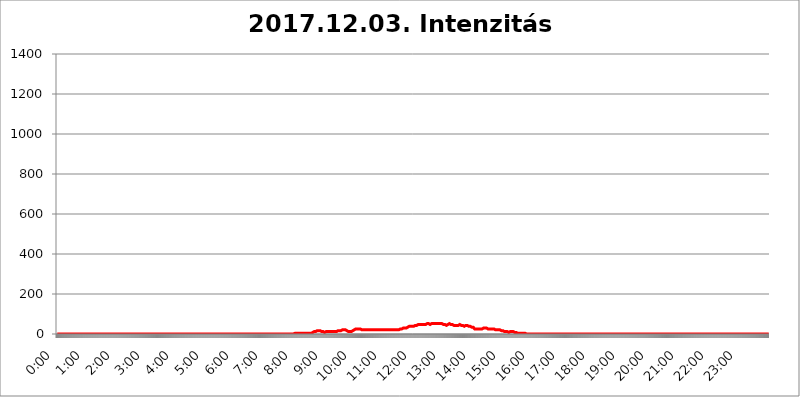
| Category | 2017.12.03. Intenzitás [W/m^2] |
|---|---|
| 0.0 | 0 |
| 0.0006944444444444445 | 0 |
| 0.001388888888888889 | 0 |
| 0.0020833333333333333 | 0 |
| 0.002777777777777778 | 0 |
| 0.003472222222222222 | 0 |
| 0.004166666666666667 | 0 |
| 0.004861111111111111 | 0 |
| 0.005555555555555556 | 0 |
| 0.0062499999999999995 | 0 |
| 0.006944444444444444 | 0 |
| 0.007638888888888889 | 0 |
| 0.008333333333333333 | 0 |
| 0.009027777777777779 | 0 |
| 0.009722222222222222 | 0 |
| 0.010416666666666666 | 0 |
| 0.011111111111111112 | 0 |
| 0.011805555555555555 | 0 |
| 0.012499999999999999 | 0 |
| 0.013194444444444444 | 0 |
| 0.013888888888888888 | 0 |
| 0.014583333333333332 | 0 |
| 0.015277777777777777 | 0 |
| 0.015972222222222224 | 0 |
| 0.016666666666666666 | 0 |
| 0.017361111111111112 | 0 |
| 0.018055555555555557 | 0 |
| 0.01875 | 0 |
| 0.019444444444444445 | 0 |
| 0.02013888888888889 | 0 |
| 0.020833333333333332 | 0 |
| 0.02152777777777778 | 0 |
| 0.022222222222222223 | 0 |
| 0.02291666666666667 | 0 |
| 0.02361111111111111 | 0 |
| 0.024305555555555556 | 0 |
| 0.024999999999999998 | 0 |
| 0.025694444444444447 | 0 |
| 0.02638888888888889 | 0 |
| 0.027083333333333334 | 0 |
| 0.027777777777777776 | 0 |
| 0.02847222222222222 | 0 |
| 0.029166666666666664 | 0 |
| 0.029861111111111113 | 0 |
| 0.030555555555555555 | 0 |
| 0.03125 | 0 |
| 0.03194444444444445 | 0 |
| 0.03263888888888889 | 0 |
| 0.03333333333333333 | 0 |
| 0.034027777777777775 | 0 |
| 0.034722222222222224 | 0 |
| 0.035416666666666666 | 0 |
| 0.036111111111111115 | 0 |
| 0.03680555555555556 | 0 |
| 0.0375 | 0 |
| 0.03819444444444444 | 0 |
| 0.03888888888888889 | 0 |
| 0.03958333333333333 | 0 |
| 0.04027777777777778 | 0 |
| 0.04097222222222222 | 0 |
| 0.041666666666666664 | 0 |
| 0.042361111111111106 | 0 |
| 0.04305555555555556 | 0 |
| 0.043750000000000004 | 0 |
| 0.044444444444444446 | 0 |
| 0.04513888888888889 | 0 |
| 0.04583333333333334 | 0 |
| 0.04652777777777778 | 0 |
| 0.04722222222222222 | 0 |
| 0.04791666666666666 | 0 |
| 0.04861111111111111 | 0 |
| 0.049305555555555554 | 0 |
| 0.049999999999999996 | 0 |
| 0.05069444444444445 | 0 |
| 0.051388888888888894 | 0 |
| 0.052083333333333336 | 0 |
| 0.05277777777777778 | 0 |
| 0.05347222222222222 | 0 |
| 0.05416666666666667 | 0 |
| 0.05486111111111111 | 0 |
| 0.05555555555555555 | 0 |
| 0.05625 | 0 |
| 0.05694444444444444 | 0 |
| 0.057638888888888885 | 0 |
| 0.05833333333333333 | 0 |
| 0.05902777777777778 | 0 |
| 0.059722222222222225 | 0 |
| 0.06041666666666667 | 0 |
| 0.061111111111111116 | 0 |
| 0.06180555555555556 | 0 |
| 0.0625 | 0 |
| 0.06319444444444444 | 0 |
| 0.06388888888888888 | 0 |
| 0.06458333333333334 | 0 |
| 0.06527777777777778 | 0 |
| 0.06597222222222222 | 0 |
| 0.06666666666666667 | 0 |
| 0.06736111111111111 | 0 |
| 0.06805555555555555 | 0 |
| 0.06874999999999999 | 0 |
| 0.06944444444444443 | 0 |
| 0.07013888888888889 | 0 |
| 0.07083333333333333 | 0 |
| 0.07152777777777779 | 0 |
| 0.07222222222222223 | 0 |
| 0.07291666666666667 | 0 |
| 0.07361111111111111 | 0 |
| 0.07430555555555556 | 0 |
| 0.075 | 0 |
| 0.07569444444444444 | 0 |
| 0.0763888888888889 | 0 |
| 0.07708333333333334 | 0 |
| 0.07777777777777778 | 0 |
| 0.07847222222222222 | 0 |
| 0.07916666666666666 | 0 |
| 0.0798611111111111 | 0 |
| 0.08055555555555556 | 0 |
| 0.08125 | 0 |
| 0.08194444444444444 | 0 |
| 0.08263888888888889 | 0 |
| 0.08333333333333333 | 0 |
| 0.08402777777777777 | 0 |
| 0.08472222222222221 | 0 |
| 0.08541666666666665 | 0 |
| 0.08611111111111112 | 0 |
| 0.08680555555555557 | 0 |
| 0.08750000000000001 | 0 |
| 0.08819444444444445 | 0 |
| 0.08888888888888889 | 0 |
| 0.08958333333333333 | 0 |
| 0.09027777777777778 | 0 |
| 0.09097222222222222 | 0 |
| 0.09166666666666667 | 0 |
| 0.09236111111111112 | 0 |
| 0.09305555555555556 | 0 |
| 0.09375 | 0 |
| 0.09444444444444444 | 0 |
| 0.09513888888888888 | 0 |
| 0.09583333333333333 | 0 |
| 0.09652777777777777 | 0 |
| 0.09722222222222222 | 0 |
| 0.09791666666666667 | 0 |
| 0.09861111111111111 | 0 |
| 0.09930555555555555 | 0 |
| 0.09999999999999999 | 0 |
| 0.10069444444444443 | 0 |
| 0.1013888888888889 | 0 |
| 0.10208333333333335 | 0 |
| 0.10277777777777779 | 0 |
| 0.10347222222222223 | 0 |
| 0.10416666666666667 | 0 |
| 0.10486111111111111 | 0 |
| 0.10555555555555556 | 0 |
| 0.10625 | 0 |
| 0.10694444444444444 | 0 |
| 0.1076388888888889 | 0 |
| 0.10833333333333334 | 0 |
| 0.10902777777777778 | 0 |
| 0.10972222222222222 | 0 |
| 0.1111111111111111 | 0 |
| 0.11180555555555556 | 0 |
| 0.11180555555555556 | 0 |
| 0.1125 | 0 |
| 0.11319444444444444 | 0 |
| 0.11388888888888889 | 0 |
| 0.11458333333333333 | 0 |
| 0.11527777777777777 | 0 |
| 0.11597222222222221 | 0 |
| 0.11666666666666665 | 0 |
| 0.1173611111111111 | 0 |
| 0.11805555555555557 | 0 |
| 0.11944444444444445 | 0 |
| 0.12013888888888889 | 0 |
| 0.12083333333333333 | 0 |
| 0.12152777777777778 | 0 |
| 0.12222222222222223 | 0 |
| 0.12291666666666667 | 0 |
| 0.12291666666666667 | 0 |
| 0.12361111111111112 | 0 |
| 0.12430555555555556 | 0 |
| 0.125 | 0 |
| 0.12569444444444444 | 0 |
| 0.12638888888888888 | 0 |
| 0.12708333333333333 | 0 |
| 0.16875 | 0 |
| 0.12847222222222224 | 0 |
| 0.12916666666666668 | 0 |
| 0.12986111111111112 | 0 |
| 0.13055555555555556 | 0 |
| 0.13125 | 0 |
| 0.13194444444444445 | 0 |
| 0.1326388888888889 | 0 |
| 0.13333333333333333 | 0 |
| 0.13402777777777777 | 0 |
| 0.13402777777777777 | 0 |
| 0.13472222222222222 | 0 |
| 0.13541666666666666 | 0 |
| 0.1361111111111111 | 0 |
| 0.13749999999999998 | 0 |
| 0.13819444444444443 | 0 |
| 0.1388888888888889 | 0 |
| 0.13958333333333334 | 0 |
| 0.14027777777777778 | 0 |
| 0.14097222222222222 | 0 |
| 0.14166666666666666 | 0 |
| 0.1423611111111111 | 0 |
| 0.14305555555555557 | 0 |
| 0.14375000000000002 | 0 |
| 0.14444444444444446 | 0 |
| 0.1451388888888889 | 0 |
| 0.1451388888888889 | 0 |
| 0.14652777777777778 | 0 |
| 0.14722222222222223 | 0 |
| 0.14791666666666667 | 0 |
| 0.1486111111111111 | 0 |
| 0.14930555555555555 | 0 |
| 0.15 | 0 |
| 0.15069444444444444 | 0 |
| 0.15138888888888888 | 0 |
| 0.15208333333333332 | 0 |
| 0.15277777777777776 | 0 |
| 0.15347222222222223 | 0 |
| 0.15416666666666667 | 0 |
| 0.15486111111111112 | 0 |
| 0.15555555555555556 | 0 |
| 0.15625 | 0 |
| 0.15694444444444444 | 0 |
| 0.15763888888888888 | 0 |
| 0.15833333333333333 | 0 |
| 0.15902777777777777 | 0 |
| 0.15972222222222224 | 0 |
| 0.16041666666666668 | 0 |
| 0.16111111111111112 | 0 |
| 0.16180555555555556 | 0 |
| 0.1625 | 0 |
| 0.16319444444444445 | 0 |
| 0.1638888888888889 | 0 |
| 0.16458333333333333 | 0 |
| 0.16527777777777777 | 0 |
| 0.16597222222222222 | 0 |
| 0.16666666666666666 | 0 |
| 0.1673611111111111 | 0 |
| 0.16805555555555554 | 0 |
| 0.16874999999999998 | 0 |
| 0.16944444444444443 | 0 |
| 0.17013888888888887 | 0 |
| 0.1708333333333333 | 0 |
| 0.17152777777777775 | 0 |
| 0.17222222222222225 | 0 |
| 0.1729166666666667 | 0 |
| 0.17361111111111113 | 0 |
| 0.17430555555555557 | 0 |
| 0.17500000000000002 | 0 |
| 0.17569444444444446 | 0 |
| 0.1763888888888889 | 0 |
| 0.17708333333333334 | 0 |
| 0.17777777777777778 | 0 |
| 0.17847222222222223 | 0 |
| 0.17916666666666667 | 0 |
| 0.1798611111111111 | 0 |
| 0.18055555555555555 | 0 |
| 0.18125 | 0 |
| 0.18194444444444444 | 0 |
| 0.1826388888888889 | 0 |
| 0.18333333333333335 | 0 |
| 0.1840277777777778 | 0 |
| 0.18472222222222223 | 0 |
| 0.18541666666666667 | 0 |
| 0.18611111111111112 | 0 |
| 0.18680555555555556 | 0 |
| 0.1875 | 0 |
| 0.18819444444444444 | 0 |
| 0.18888888888888888 | 0 |
| 0.18958333333333333 | 0 |
| 0.19027777777777777 | 0 |
| 0.1909722222222222 | 0 |
| 0.19166666666666665 | 0 |
| 0.19236111111111112 | 0 |
| 0.19305555555555554 | 0 |
| 0.19375 | 0 |
| 0.19444444444444445 | 0 |
| 0.1951388888888889 | 0 |
| 0.19583333333333333 | 0 |
| 0.19652777777777777 | 0 |
| 0.19722222222222222 | 0 |
| 0.19791666666666666 | 0 |
| 0.1986111111111111 | 0 |
| 0.19930555555555554 | 0 |
| 0.19999999999999998 | 0 |
| 0.20069444444444443 | 0 |
| 0.20138888888888887 | 0 |
| 0.2020833333333333 | 0 |
| 0.2027777777777778 | 0 |
| 0.2034722222222222 | 0 |
| 0.2041666666666667 | 0 |
| 0.20486111111111113 | 0 |
| 0.20555555555555557 | 0 |
| 0.20625000000000002 | 0 |
| 0.20694444444444446 | 0 |
| 0.2076388888888889 | 0 |
| 0.20833333333333334 | 0 |
| 0.20902777777777778 | 0 |
| 0.20972222222222223 | 0 |
| 0.21041666666666667 | 0 |
| 0.2111111111111111 | 0 |
| 0.21180555555555555 | 0 |
| 0.2125 | 0 |
| 0.21319444444444444 | 0 |
| 0.2138888888888889 | 0 |
| 0.21458333333333335 | 0 |
| 0.2152777777777778 | 0 |
| 0.21597222222222223 | 0 |
| 0.21666666666666667 | 0 |
| 0.21736111111111112 | 0 |
| 0.21805555555555556 | 0 |
| 0.21875 | 0 |
| 0.21944444444444444 | 0 |
| 0.22013888888888888 | 0 |
| 0.22083333333333333 | 0 |
| 0.22152777777777777 | 0 |
| 0.2222222222222222 | 0 |
| 0.22291666666666665 | 0 |
| 0.2236111111111111 | 0 |
| 0.22430555555555556 | 0 |
| 0.225 | 0 |
| 0.22569444444444445 | 0 |
| 0.2263888888888889 | 0 |
| 0.22708333333333333 | 0 |
| 0.22777777777777777 | 0 |
| 0.22847222222222222 | 0 |
| 0.22916666666666666 | 0 |
| 0.2298611111111111 | 0 |
| 0.23055555555555554 | 0 |
| 0.23124999999999998 | 0 |
| 0.23194444444444443 | 0 |
| 0.23263888888888887 | 0 |
| 0.2333333333333333 | 0 |
| 0.2340277777777778 | 0 |
| 0.2347222222222222 | 0 |
| 0.2354166666666667 | 0 |
| 0.23611111111111113 | 0 |
| 0.23680555555555557 | 0 |
| 0.23750000000000002 | 0 |
| 0.23819444444444446 | 0 |
| 0.2388888888888889 | 0 |
| 0.23958333333333334 | 0 |
| 0.24027777777777778 | 0 |
| 0.24097222222222223 | 0 |
| 0.24166666666666667 | 0 |
| 0.2423611111111111 | 0 |
| 0.24305555555555555 | 0 |
| 0.24375 | 0 |
| 0.24444444444444446 | 0 |
| 0.24513888888888888 | 0 |
| 0.24583333333333335 | 0 |
| 0.2465277777777778 | 0 |
| 0.24722222222222223 | 0 |
| 0.24791666666666667 | 0 |
| 0.24861111111111112 | 0 |
| 0.24930555555555556 | 0 |
| 0.25 | 0 |
| 0.25069444444444444 | 0 |
| 0.2513888888888889 | 0 |
| 0.2520833333333333 | 0 |
| 0.25277777777777777 | 0 |
| 0.2534722222222222 | 0 |
| 0.25416666666666665 | 0 |
| 0.2548611111111111 | 0 |
| 0.2555555555555556 | 0 |
| 0.25625000000000003 | 0 |
| 0.2569444444444445 | 0 |
| 0.2576388888888889 | 0 |
| 0.25833333333333336 | 0 |
| 0.2590277777777778 | 0 |
| 0.25972222222222224 | 0 |
| 0.2604166666666667 | 0 |
| 0.2611111111111111 | 0 |
| 0.26180555555555557 | 0 |
| 0.2625 | 0 |
| 0.26319444444444445 | 0 |
| 0.2638888888888889 | 0 |
| 0.26458333333333334 | 0 |
| 0.2652777777777778 | 0 |
| 0.2659722222222222 | 0 |
| 0.26666666666666666 | 0 |
| 0.2673611111111111 | 0 |
| 0.26805555555555555 | 0 |
| 0.26875 | 0 |
| 0.26944444444444443 | 0 |
| 0.2701388888888889 | 0 |
| 0.2708333333333333 | 0 |
| 0.27152777777777776 | 0 |
| 0.2722222222222222 | 0 |
| 0.27291666666666664 | 0 |
| 0.2736111111111111 | 0 |
| 0.2743055555555555 | 0 |
| 0.27499999999999997 | 0 |
| 0.27569444444444446 | 0 |
| 0.27638888888888885 | 0 |
| 0.27708333333333335 | 0 |
| 0.2777777777777778 | 0 |
| 0.27847222222222223 | 0 |
| 0.2791666666666667 | 0 |
| 0.2798611111111111 | 0 |
| 0.28055555555555556 | 0 |
| 0.28125 | 0 |
| 0.28194444444444444 | 0 |
| 0.2826388888888889 | 0 |
| 0.2833333333333333 | 0 |
| 0.28402777777777777 | 0 |
| 0.2847222222222222 | 0 |
| 0.28541666666666665 | 0 |
| 0.28611111111111115 | 0 |
| 0.28680555555555554 | 0 |
| 0.28750000000000003 | 0 |
| 0.2881944444444445 | 0 |
| 0.2888888888888889 | 0 |
| 0.28958333333333336 | 0 |
| 0.2902777777777778 | 0 |
| 0.29097222222222224 | 0 |
| 0.2916666666666667 | 0 |
| 0.2923611111111111 | 0 |
| 0.29305555555555557 | 0 |
| 0.29375 | 0 |
| 0.29444444444444445 | 0 |
| 0.2951388888888889 | 0 |
| 0.29583333333333334 | 0 |
| 0.2965277777777778 | 0 |
| 0.2972222222222222 | 0 |
| 0.29791666666666666 | 0 |
| 0.2986111111111111 | 0 |
| 0.29930555555555555 | 0 |
| 0.3 | 0 |
| 0.30069444444444443 | 0 |
| 0.3013888888888889 | 0 |
| 0.3020833333333333 | 0 |
| 0.30277777777777776 | 0 |
| 0.3034722222222222 | 0 |
| 0.30416666666666664 | 0 |
| 0.3048611111111111 | 0 |
| 0.3055555555555555 | 0 |
| 0.30624999999999997 | 0 |
| 0.3069444444444444 | 0 |
| 0.3076388888888889 | 0 |
| 0.30833333333333335 | 0 |
| 0.3090277777777778 | 0 |
| 0.30972222222222223 | 0 |
| 0.3104166666666667 | 0 |
| 0.3111111111111111 | 0 |
| 0.31180555555555556 | 0 |
| 0.3125 | 0 |
| 0.31319444444444444 | 0 |
| 0.3138888888888889 | 0 |
| 0.3145833333333333 | 0 |
| 0.31527777777777777 | 0 |
| 0.3159722222222222 | 0 |
| 0.31666666666666665 | 0 |
| 0.31736111111111115 | 0 |
| 0.31805555555555554 | 0 |
| 0.31875000000000003 | 0 |
| 0.3194444444444445 | 0 |
| 0.3201388888888889 | 0 |
| 0.32083333333333336 | 0 |
| 0.3215277777777778 | 0 |
| 0.32222222222222224 | 0 |
| 0.3229166666666667 | 0 |
| 0.3236111111111111 | 0 |
| 0.32430555555555557 | 0 |
| 0.325 | 0 |
| 0.32569444444444445 | 0 |
| 0.3263888888888889 | 0 |
| 0.32708333333333334 | 0 |
| 0.3277777777777778 | 0 |
| 0.3284722222222222 | 0 |
| 0.32916666666666666 | 0 |
| 0.3298611111111111 | 0 |
| 0.33055555555555555 | 0 |
| 0.33125 | 0 |
| 0.33194444444444443 | 3.525 |
| 0.3326388888888889 | 3.525 |
| 0.3333333333333333 | 3.525 |
| 0.3340277777777778 | 3.525 |
| 0.3347222222222222 | 3.525 |
| 0.3354166666666667 | 3.525 |
| 0.3361111111111111 | 3.525 |
| 0.3368055555555556 | 3.525 |
| 0.33749999999999997 | 3.525 |
| 0.33819444444444446 | 3.525 |
| 0.33888888888888885 | 3.525 |
| 0.33958333333333335 | 3.525 |
| 0.34027777777777773 | 3.525 |
| 0.34097222222222223 | 3.525 |
| 0.3416666666666666 | 3.525 |
| 0.3423611111111111 | 3.525 |
| 0.3430555555555555 | 3.525 |
| 0.34375 | 3.525 |
| 0.3444444444444445 | 3.525 |
| 0.3451388888888889 | 3.525 |
| 0.3458333333333334 | 3.525 |
| 0.34652777777777777 | 3.525 |
| 0.34722222222222227 | 3.525 |
| 0.34791666666666665 | 3.525 |
| 0.34861111111111115 | 3.525 |
| 0.34930555555555554 | 3.525 |
| 0.35000000000000003 | 3.525 |
| 0.3506944444444444 | 3.525 |
| 0.3513888888888889 | 3.525 |
| 0.3520833333333333 | 3.525 |
| 0.3527777777777778 | 3.525 |
| 0.3534722222222222 | 3.525 |
| 0.3541666666666667 | 3.525 |
| 0.3548611111111111 | 3.525 |
| 0.35555555555555557 | 3.525 |
| 0.35625 | 3.525 |
| 0.35694444444444445 | 7.887 |
| 0.3576388888888889 | 7.887 |
| 0.35833333333333334 | 7.887 |
| 0.3590277777777778 | 12.257 |
| 0.3597222222222222 | 12.257 |
| 0.36041666666666666 | 12.257 |
| 0.3611111111111111 | 12.257 |
| 0.36180555555555555 | 12.257 |
| 0.3625 | 12.257 |
| 0.36319444444444443 | 12.257 |
| 0.3638888888888889 | 12.257 |
| 0.3645833333333333 | 16.636 |
| 0.3652777777777778 | 12.257 |
| 0.3659722222222222 | 16.636 |
| 0.3666666666666667 | 16.636 |
| 0.3673611111111111 | 16.636 |
| 0.3680555555555556 | 16.636 |
| 0.36874999999999997 | 16.636 |
| 0.36944444444444446 | 16.636 |
| 0.37013888888888885 | 16.636 |
| 0.37083333333333335 | 12.257 |
| 0.37152777777777773 | 12.257 |
| 0.37222222222222223 | 12.257 |
| 0.3729166666666666 | 12.257 |
| 0.3736111111111111 | 12.257 |
| 0.3743055555555555 | 7.887 |
| 0.375 | 7.887 |
| 0.3756944444444445 | 7.887 |
| 0.3763888888888889 | 12.257 |
| 0.3770833333333334 | 12.257 |
| 0.37777777777777777 | 12.257 |
| 0.37847222222222227 | 12.257 |
| 0.37916666666666665 | 12.257 |
| 0.37986111111111115 | 12.257 |
| 0.38055555555555554 | 12.257 |
| 0.38125000000000003 | 12.257 |
| 0.3819444444444444 | 12.257 |
| 0.3826388888888889 | 16.636 |
| 0.3833333333333333 | 12.257 |
| 0.3840277777777778 | 12.257 |
| 0.3847222222222222 | 12.257 |
| 0.3854166666666667 | 12.257 |
| 0.3861111111111111 | 12.257 |
| 0.38680555555555557 | 12.257 |
| 0.3875 | 12.257 |
| 0.38819444444444445 | 12.257 |
| 0.3888888888888889 | 12.257 |
| 0.38958333333333334 | 12.257 |
| 0.3902777777777778 | 12.257 |
| 0.3909722222222222 | 12.257 |
| 0.39166666666666666 | 12.257 |
| 0.3923611111111111 | 12.257 |
| 0.39305555555555555 | 12.257 |
| 0.39375 | 16.636 |
| 0.39444444444444443 | 16.636 |
| 0.3951388888888889 | 16.636 |
| 0.3958333333333333 | 16.636 |
| 0.3965277777777778 | 16.636 |
| 0.3972222222222222 | 16.636 |
| 0.3979166666666667 | 16.636 |
| 0.3986111111111111 | 16.636 |
| 0.3993055555555556 | 21.024 |
| 0.39999999999999997 | 21.024 |
| 0.40069444444444446 | 21.024 |
| 0.40138888888888885 | 21.024 |
| 0.40208333333333335 | 21.024 |
| 0.40277777777777773 | 21.024 |
| 0.40347222222222223 | 21.024 |
| 0.4041666666666666 | 21.024 |
| 0.4048611111111111 | 16.636 |
| 0.4055555555555555 | 16.636 |
| 0.40625 | 16.636 |
| 0.4069444444444445 | 16.636 |
| 0.4076388888888889 | 16.636 |
| 0.4083333333333334 | 12.257 |
| 0.40902777777777777 | 16.636 |
| 0.40972222222222227 | 16.636 |
| 0.41041666666666665 | 12.257 |
| 0.41111111111111115 | 12.257 |
| 0.41180555555555554 | 12.257 |
| 0.41250000000000003 | 12.257 |
| 0.4131944444444444 | 16.636 |
| 0.4138888888888889 | 16.636 |
| 0.4145833333333333 | 16.636 |
| 0.4152777777777778 | 21.024 |
| 0.4159722222222222 | 21.024 |
| 0.4166666666666667 | 21.024 |
| 0.4173611111111111 | 21.024 |
| 0.41805555555555557 | 21.024 |
| 0.41875 | 25.419 |
| 0.41944444444444445 | 25.419 |
| 0.4201388888888889 | 25.419 |
| 0.42083333333333334 | 25.419 |
| 0.4215277777777778 | 25.419 |
| 0.4222222222222222 | 25.419 |
| 0.42291666666666666 | 25.419 |
| 0.4236111111111111 | 25.419 |
| 0.42430555555555555 | 25.419 |
| 0.425 | 25.419 |
| 0.42569444444444443 | 21.024 |
| 0.4263888888888889 | 21.024 |
| 0.4270833333333333 | 21.024 |
| 0.4277777777777778 | 21.024 |
| 0.4284722222222222 | 21.024 |
| 0.4291666666666667 | 21.024 |
| 0.4298611111111111 | 21.024 |
| 0.4305555555555556 | 21.024 |
| 0.43124999999999997 | 21.024 |
| 0.43194444444444446 | 21.024 |
| 0.43263888888888885 | 21.024 |
| 0.43333333333333335 | 21.024 |
| 0.43402777777777773 | 21.024 |
| 0.43472222222222223 | 21.024 |
| 0.4354166666666666 | 21.024 |
| 0.4361111111111111 | 21.024 |
| 0.4368055555555555 | 21.024 |
| 0.4375 | 21.024 |
| 0.4381944444444445 | 21.024 |
| 0.4388888888888889 | 21.024 |
| 0.4395833333333334 | 21.024 |
| 0.44027777777777777 | 21.024 |
| 0.44097222222222227 | 21.024 |
| 0.44166666666666665 | 21.024 |
| 0.44236111111111115 | 21.024 |
| 0.44305555555555554 | 21.024 |
| 0.44375000000000003 | 21.024 |
| 0.4444444444444444 | 21.024 |
| 0.4451388888888889 | 21.024 |
| 0.4458333333333333 | 21.024 |
| 0.4465277777777778 | 21.024 |
| 0.4472222222222222 | 21.024 |
| 0.4479166666666667 | 21.024 |
| 0.4486111111111111 | 21.024 |
| 0.44930555555555557 | 21.024 |
| 0.45 | 21.024 |
| 0.45069444444444445 | 21.024 |
| 0.4513888888888889 | 21.024 |
| 0.45208333333333334 | 21.024 |
| 0.4527777777777778 | 21.024 |
| 0.4534722222222222 | 21.024 |
| 0.45416666666666666 | 21.024 |
| 0.4548611111111111 | 21.024 |
| 0.45555555555555555 | 21.024 |
| 0.45625 | 21.024 |
| 0.45694444444444443 | 21.024 |
| 0.4576388888888889 | 21.024 |
| 0.4583333333333333 | 21.024 |
| 0.4590277777777778 | 21.024 |
| 0.4597222222222222 | 21.024 |
| 0.4604166666666667 | 21.024 |
| 0.4611111111111111 | 21.024 |
| 0.4618055555555556 | 21.024 |
| 0.46249999999999997 | 21.024 |
| 0.46319444444444446 | 21.024 |
| 0.46388888888888885 | 21.024 |
| 0.46458333333333335 | 21.024 |
| 0.46527777777777773 | 21.024 |
| 0.46597222222222223 | 21.024 |
| 0.4666666666666666 | 21.024 |
| 0.4673611111111111 | 21.024 |
| 0.4680555555555555 | 21.024 |
| 0.46875 | 21.024 |
| 0.4694444444444445 | 21.024 |
| 0.4701388888888889 | 21.024 |
| 0.4708333333333334 | 21.024 |
| 0.47152777777777777 | 21.024 |
| 0.47222222222222227 | 21.024 |
| 0.47291666666666665 | 21.024 |
| 0.47361111111111115 | 21.024 |
| 0.47430555555555554 | 21.024 |
| 0.47500000000000003 | 21.024 |
| 0.4756944444444444 | 21.024 |
| 0.4763888888888889 | 21.024 |
| 0.4770833333333333 | 21.024 |
| 0.4777777777777778 | 21.024 |
| 0.4784722222222222 | 21.024 |
| 0.4791666666666667 | 21.024 |
| 0.4798611111111111 | 21.024 |
| 0.48055555555555557 | 25.419 |
| 0.48125 | 25.419 |
| 0.48194444444444445 | 25.419 |
| 0.4826388888888889 | 25.419 |
| 0.48333333333333334 | 25.419 |
| 0.4840277777777778 | 25.419 |
| 0.4847222222222222 | 29.823 |
| 0.48541666666666666 | 29.823 |
| 0.4861111111111111 | 29.823 |
| 0.48680555555555555 | 29.823 |
| 0.4875 | 29.823 |
| 0.48819444444444443 | 29.823 |
| 0.4888888888888889 | 29.823 |
| 0.4895833333333333 | 29.823 |
| 0.4902777777777778 | 34.234 |
| 0.4909722222222222 | 34.234 |
| 0.4916666666666667 | 34.234 |
| 0.4923611111111111 | 34.234 |
| 0.4930555555555556 | 34.234 |
| 0.49374999999999997 | 38.653 |
| 0.49444444444444446 | 34.234 |
| 0.49513888888888885 | 34.234 |
| 0.49583333333333335 | 38.653 |
| 0.49652777777777773 | 38.653 |
| 0.49722222222222223 | 38.653 |
| 0.4979166666666666 | 38.653 |
| 0.4986111111111111 | 38.653 |
| 0.4993055555555555 | 38.653 |
| 0.5 | 38.653 |
| 0.5006944444444444 | 38.653 |
| 0.5013888888888889 | 43.079 |
| 0.5020833333333333 | 43.079 |
| 0.5027777777777778 | 43.079 |
| 0.5034722222222222 | 43.079 |
| 0.5041666666666667 | 43.079 |
| 0.5048611111111111 | 47.511 |
| 0.5055555555555555 | 47.511 |
| 0.50625 | 47.511 |
| 0.5069444444444444 | 47.511 |
| 0.5076388888888889 | 47.511 |
| 0.5083333333333333 | 47.511 |
| 0.5090277777777777 | 47.511 |
| 0.5097222222222222 | 47.511 |
| 0.5104166666666666 | 47.511 |
| 0.5111111111111112 | 47.511 |
| 0.5118055555555555 | 47.511 |
| 0.5125000000000001 | 47.511 |
| 0.5131944444444444 | 47.511 |
| 0.513888888888889 | 47.511 |
| 0.5145833333333333 | 47.511 |
| 0.5152777777777778 | 47.511 |
| 0.5159722222222222 | 47.511 |
| 0.5166666666666667 | 47.511 |
| 0.517361111111111 | 47.511 |
| 0.5180555555555556 | 51.951 |
| 0.5187499999999999 | 51.951 |
| 0.5194444444444445 | 51.951 |
| 0.5201388888888888 | 51.951 |
| 0.5208333333333334 | 51.951 |
| 0.5215277777777778 | 47.511 |
| 0.5222222222222223 | 47.511 |
| 0.5229166666666667 | 47.511 |
| 0.5236111111111111 | 51.951 |
| 0.5243055555555556 | 51.951 |
| 0.525 | 51.951 |
| 0.5256944444444445 | 51.951 |
| 0.5263888888888889 | 51.951 |
| 0.5270833333333333 | 51.951 |
| 0.5277777777777778 | 51.951 |
| 0.5284722222222222 | 47.511 |
| 0.5291666666666667 | 51.951 |
| 0.5298611111111111 | 51.951 |
| 0.5305555555555556 | 51.951 |
| 0.53125 | 51.951 |
| 0.5319444444444444 | 51.951 |
| 0.5326388888888889 | 51.951 |
| 0.5333333333333333 | 51.951 |
| 0.5340277777777778 | 51.951 |
| 0.5347222222222222 | 51.951 |
| 0.5354166666666667 | 51.951 |
| 0.5361111111111111 | 51.951 |
| 0.5368055555555555 | 51.951 |
| 0.5375 | 51.951 |
| 0.5381944444444444 | 51.951 |
| 0.5388888888888889 | 51.951 |
| 0.5395833333333333 | 51.951 |
| 0.5402777777777777 | 51.951 |
| 0.5409722222222222 | 51.951 |
| 0.5416666666666666 | 47.511 |
| 0.5423611111111112 | 47.511 |
| 0.5430555555555555 | 47.511 |
| 0.5437500000000001 | 47.511 |
| 0.5444444444444444 | 43.079 |
| 0.545138888888889 | 47.511 |
| 0.5458333333333333 | 43.079 |
| 0.5465277777777778 | 43.079 |
| 0.5472222222222222 | 47.511 |
| 0.5479166666666667 | 47.511 |
| 0.548611111111111 | 51.951 |
| 0.5493055555555556 | 51.951 |
| 0.5499999999999999 | 51.951 |
| 0.5506944444444445 | 47.511 |
| 0.5513888888888888 | 47.511 |
| 0.5520833333333334 | 47.511 |
| 0.5527777777777778 | 47.511 |
| 0.5534722222222223 | 47.511 |
| 0.5541666666666667 | 47.511 |
| 0.5548611111111111 | 47.511 |
| 0.5555555555555556 | 47.511 |
| 0.55625 | 43.079 |
| 0.5569444444444445 | 43.079 |
| 0.5576388888888889 | 43.079 |
| 0.5583333333333333 | 43.079 |
| 0.5590277777777778 | 43.079 |
| 0.5597222222222222 | 43.079 |
| 0.5604166666666667 | 43.079 |
| 0.5611111111111111 | 43.079 |
| 0.5618055555555556 | 43.079 |
| 0.5625 | 43.079 |
| 0.5631944444444444 | 47.511 |
| 0.5638888888888889 | 47.511 |
| 0.5645833333333333 | 47.511 |
| 0.5652777777777778 | 47.511 |
| 0.5659722222222222 | 43.079 |
| 0.5666666666666667 | 43.079 |
| 0.5673611111111111 | 47.511 |
| 0.5680555555555555 | 47.511 |
| 0.56875 | 43.079 |
| 0.5694444444444444 | 43.079 |
| 0.5701388888888889 | 43.079 |
| 0.5708333333333333 | 38.653 |
| 0.5715277777777777 | 38.653 |
| 0.5722222222222222 | 38.653 |
| 0.5729166666666666 | 43.079 |
| 0.5736111111111112 | 43.079 |
| 0.5743055555555555 | 43.079 |
| 0.5750000000000001 | 43.079 |
| 0.5756944444444444 | 43.079 |
| 0.576388888888889 | 38.653 |
| 0.5770833333333333 | 38.653 |
| 0.5777777777777778 | 43.079 |
| 0.5784722222222222 | 43.079 |
| 0.5791666666666667 | 38.653 |
| 0.579861111111111 | 38.653 |
| 0.5805555555555556 | 34.234 |
| 0.5812499999999999 | 34.234 |
| 0.5819444444444445 | 34.234 |
| 0.5826388888888888 | 34.234 |
| 0.5833333333333334 | 34.234 |
| 0.5840277777777778 | 34.234 |
| 0.5847222222222223 | 29.823 |
| 0.5854166666666667 | 25.419 |
| 0.5861111111111111 | 25.419 |
| 0.5868055555555556 | 25.419 |
| 0.5875 | 25.419 |
| 0.5881944444444445 | 25.419 |
| 0.5888888888888889 | 25.419 |
| 0.5895833333333333 | 25.419 |
| 0.5902777777777778 | 25.419 |
| 0.5909722222222222 | 25.419 |
| 0.5916666666666667 | 25.419 |
| 0.5923611111111111 | 25.419 |
| 0.5930555555555556 | 25.419 |
| 0.59375 | 25.419 |
| 0.5944444444444444 | 25.419 |
| 0.5951388888888889 | 25.419 |
| 0.5958333333333333 | 25.419 |
| 0.5965277777777778 | 25.419 |
| 0.5972222222222222 | 29.823 |
| 0.5979166666666667 | 29.823 |
| 0.5986111111111111 | 29.823 |
| 0.5993055555555555 | 29.823 |
| 0.6 | 29.823 |
| 0.6006944444444444 | 29.823 |
| 0.6013888888888889 | 29.823 |
| 0.6020833333333333 | 29.823 |
| 0.6027777777777777 | 25.419 |
| 0.6034722222222222 | 25.419 |
| 0.6041666666666666 | 25.419 |
| 0.6048611111111112 | 25.419 |
| 0.6055555555555555 | 25.419 |
| 0.6062500000000001 | 25.419 |
| 0.6069444444444444 | 25.419 |
| 0.607638888888889 | 29.823 |
| 0.6083333333333333 | 25.419 |
| 0.6090277777777778 | 25.419 |
| 0.6097222222222222 | 25.419 |
| 0.6104166666666667 | 25.419 |
| 0.611111111111111 | 25.419 |
| 0.6118055555555556 | 21.024 |
| 0.6124999999999999 | 25.419 |
| 0.6131944444444445 | 21.024 |
| 0.6138888888888888 | 21.024 |
| 0.6145833333333334 | 21.024 |
| 0.6152777777777778 | 21.024 |
| 0.6159722222222223 | 21.024 |
| 0.6166666666666667 | 21.024 |
| 0.6173611111111111 | 21.024 |
| 0.6180555555555556 | 21.024 |
| 0.61875 | 21.024 |
| 0.6194444444444445 | 21.024 |
| 0.6201388888888889 | 21.024 |
| 0.6208333333333333 | 21.024 |
| 0.6215277777777778 | 21.024 |
| 0.6222222222222222 | 21.024 |
| 0.6229166666666667 | 16.636 |
| 0.6236111111111111 | 16.636 |
| 0.6243055555555556 | 16.636 |
| 0.625 | 16.636 |
| 0.6256944444444444 | 12.257 |
| 0.6263888888888889 | 12.257 |
| 0.6270833333333333 | 12.257 |
| 0.6277777777777778 | 12.257 |
| 0.6284722222222222 | 12.257 |
| 0.6291666666666667 | 12.257 |
| 0.6298611111111111 | 12.257 |
| 0.6305555555555555 | 12.257 |
| 0.63125 | 12.257 |
| 0.6319444444444444 | 12.257 |
| 0.6326388888888889 | 7.887 |
| 0.6333333333333333 | 7.887 |
| 0.6340277777777777 | 12.257 |
| 0.6347222222222222 | 7.887 |
| 0.6354166666666666 | 12.257 |
| 0.6361111111111112 | 7.887 |
| 0.6368055555555555 | 7.887 |
| 0.6375000000000001 | 12.257 |
| 0.6381944444444444 | 7.887 |
| 0.638888888888889 | 12.257 |
| 0.6395833333333333 | 12.257 |
| 0.6402777777777778 | 12.257 |
| 0.6409722222222222 | 12.257 |
| 0.6416666666666667 | 7.887 |
| 0.642361111111111 | 7.887 |
| 0.6430555555555556 | 7.887 |
| 0.6437499999999999 | 7.887 |
| 0.6444444444444445 | 7.887 |
| 0.6451388888888888 | 7.887 |
| 0.6458333333333334 | 3.525 |
| 0.6465277777777778 | 3.525 |
| 0.6472222222222223 | 3.525 |
| 0.6479166666666667 | 3.525 |
| 0.6486111111111111 | 3.525 |
| 0.6493055555555556 | 3.525 |
| 0.65 | 3.525 |
| 0.6506944444444445 | 3.525 |
| 0.6513888888888889 | 3.525 |
| 0.6520833333333333 | 3.525 |
| 0.6527777777777778 | 3.525 |
| 0.6534722222222222 | 3.525 |
| 0.6541666666666667 | 3.525 |
| 0.6548611111111111 | 3.525 |
| 0.6555555555555556 | 3.525 |
| 0.65625 | 3.525 |
| 0.6569444444444444 | 3.525 |
| 0.6576388888888889 | 0 |
| 0.6583333333333333 | 0 |
| 0.6590277777777778 | 0 |
| 0.6597222222222222 | 0 |
| 0.6604166666666667 | 0 |
| 0.6611111111111111 | 0 |
| 0.6618055555555555 | 0 |
| 0.6625 | 0 |
| 0.6631944444444444 | 0 |
| 0.6638888888888889 | 0 |
| 0.6645833333333333 | 0 |
| 0.6652777777777777 | 0 |
| 0.6659722222222222 | 0 |
| 0.6666666666666666 | 0 |
| 0.6673611111111111 | 0 |
| 0.6680555555555556 | 0 |
| 0.6687500000000001 | 0 |
| 0.6694444444444444 | 0 |
| 0.6701388888888888 | 0 |
| 0.6708333333333334 | 0 |
| 0.6715277777777778 | 0 |
| 0.6722222222222222 | 0 |
| 0.6729166666666666 | 0 |
| 0.6736111111111112 | 0 |
| 0.6743055555555556 | 0 |
| 0.6749999999999999 | 0 |
| 0.6756944444444444 | 0 |
| 0.6763888888888889 | 0 |
| 0.6770833333333334 | 0 |
| 0.6777777777777777 | 0 |
| 0.6784722222222223 | 0 |
| 0.6791666666666667 | 0 |
| 0.6798611111111111 | 0 |
| 0.6805555555555555 | 0 |
| 0.68125 | 0 |
| 0.6819444444444445 | 0 |
| 0.6826388888888889 | 0 |
| 0.6833333333333332 | 0 |
| 0.6840277777777778 | 0 |
| 0.6847222222222222 | 0 |
| 0.6854166666666667 | 0 |
| 0.686111111111111 | 0 |
| 0.6868055555555556 | 0 |
| 0.6875 | 0 |
| 0.6881944444444444 | 0 |
| 0.688888888888889 | 0 |
| 0.6895833333333333 | 0 |
| 0.6902777777777778 | 0 |
| 0.6909722222222222 | 0 |
| 0.6916666666666668 | 0 |
| 0.6923611111111111 | 0 |
| 0.6930555555555555 | 0 |
| 0.69375 | 0 |
| 0.6944444444444445 | 0 |
| 0.6951388888888889 | 0 |
| 0.6958333333333333 | 0 |
| 0.6965277777777777 | 0 |
| 0.6972222222222223 | 0 |
| 0.6979166666666666 | 0 |
| 0.6986111111111111 | 0 |
| 0.6993055555555556 | 0 |
| 0.7000000000000001 | 0 |
| 0.7006944444444444 | 0 |
| 0.7013888888888888 | 0 |
| 0.7020833333333334 | 0 |
| 0.7027777777777778 | 0 |
| 0.7034722222222222 | 0 |
| 0.7041666666666666 | 0 |
| 0.7048611111111112 | 0 |
| 0.7055555555555556 | 0 |
| 0.7062499999999999 | 0 |
| 0.7069444444444444 | 0 |
| 0.7076388888888889 | 0 |
| 0.7083333333333334 | 0 |
| 0.7090277777777777 | 0 |
| 0.7097222222222223 | 0 |
| 0.7104166666666667 | 0 |
| 0.7111111111111111 | 0 |
| 0.7118055555555555 | 0 |
| 0.7125 | 0 |
| 0.7131944444444445 | 0 |
| 0.7138888888888889 | 0 |
| 0.7145833333333332 | 0 |
| 0.7152777777777778 | 0 |
| 0.7159722222222222 | 0 |
| 0.7166666666666667 | 0 |
| 0.717361111111111 | 0 |
| 0.7180555555555556 | 0 |
| 0.71875 | 0 |
| 0.7194444444444444 | 0 |
| 0.720138888888889 | 0 |
| 0.7208333333333333 | 0 |
| 0.7215277777777778 | 0 |
| 0.7222222222222222 | 0 |
| 0.7229166666666668 | 0 |
| 0.7236111111111111 | 0 |
| 0.7243055555555555 | 0 |
| 0.725 | 0 |
| 0.7256944444444445 | 0 |
| 0.7263888888888889 | 0 |
| 0.7270833333333333 | 0 |
| 0.7277777777777777 | 0 |
| 0.7284722222222223 | 0 |
| 0.7291666666666666 | 0 |
| 0.7298611111111111 | 0 |
| 0.7305555555555556 | 0 |
| 0.7312500000000001 | 0 |
| 0.7319444444444444 | 0 |
| 0.7326388888888888 | 0 |
| 0.7333333333333334 | 0 |
| 0.7340277777777778 | 0 |
| 0.7347222222222222 | 0 |
| 0.7354166666666666 | 0 |
| 0.7361111111111112 | 0 |
| 0.7368055555555556 | 0 |
| 0.7374999999999999 | 0 |
| 0.7381944444444444 | 0 |
| 0.7388888888888889 | 0 |
| 0.7395833333333334 | 0 |
| 0.7402777777777777 | 0 |
| 0.7409722222222223 | 0 |
| 0.7416666666666667 | 0 |
| 0.7423611111111111 | 0 |
| 0.7430555555555555 | 0 |
| 0.74375 | 0 |
| 0.7444444444444445 | 0 |
| 0.7451388888888889 | 0 |
| 0.7458333333333332 | 0 |
| 0.7465277777777778 | 0 |
| 0.7472222222222222 | 0 |
| 0.7479166666666667 | 0 |
| 0.748611111111111 | 0 |
| 0.7493055555555556 | 0 |
| 0.75 | 0 |
| 0.7506944444444444 | 0 |
| 0.751388888888889 | 0 |
| 0.7520833333333333 | 0 |
| 0.7527777777777778 | 0 |
| 0.7534722222222222 | 0 |
| 0.7541666666666668 | 0 |
| 0.7548611111111111 | 0 |
| 0.7555555555555555 | 0 |
| 0.75625 | 0 |
| 0.7569444444444445 | 0 |
| 0.7576388888888889 | 0 |
| 0.7583333333333333 | 0 |
| 0.7590277777777777 | 0 |
| 0.7597222222222223 | 0 |
| 0.7604166666666666 | 0 |
| 0.7611111111111111 | 0 |
| 0.7618055555555556 | 0 |
| 0.7625000000000001 | 0 |
| 0.7631944444444444 | 0 |
| 0.7638888888888888 | 0 |
| 0.7645833333333334 | 0 |
| 0.7652777777777778 | 0 |
| 0.7659722222222222 | 0 |
| 0.7666666666666666 | 0 |
| 0.7673611111111112 | 0 |
| 0.7680555555555556 | 0 |
| 0.7687499999999999 | 0 |
| 0.7694444444444444 | 0 |
| 0.7701388888888889 | 0 |
| 0.7708333333333334 | 0 |
| 0.7715277777777777 | 0 |
| 0.7722222222222223 | 0 |
| 0.7729166666666667 | 0 |
| 0.7736111111111111 | 0 |
| 0.7743055555555555 | 0 |
| 0.775 | 0 |
| 0.7756944444444445 | 0 |
| 0.7763888888888889 | 0 |
| 0.7770833333333332 | 0 |
| 0.7777777777777778 | 0 |
| 0.7784722222222222 | 0 |
| 0.7791666666666667 | 0 |
| 0.779861111111111 | 0 |
| 0.7805555555555556 | 0 |
| 0.78125 | 0 |
| 0.7819444444444444 | 0 |
| 0.782638888888889 | 0 |
| 0.7833333333333333 | 0 |
| 0.7840277777777778 | 0 |
| 0.7847222222222222 | 0 |
| 0.7854166666666668 | 0 |
| 0.7861111111111111 | 0 |
| 0.7868055555555555 | 0 |
| 0.7875 | 0 |
| 0.7881944444444445 | 0 |
| 0.7888888888888889 | 0 |
| 0.7895833333333333 | 0 |
| 0.7902777777777777 | 0 |
| 0.7909722222222223 | 0 |
| 0.7916666666666666 | 0 |
| 0.7923611111111111 | 0 |
| 0.7930555555555556 | 0 |
| 0.7937500000000001 | 0 |
| 0.7944444444444444 | 0 |
| 0.7951388888888888 | 0 |
| 0.7958333333333334 | 0 |
| 0.7965277777777778 | 0 |
| 0.7972222222222222 | 0 |
| 0.7979166666666666 | 0 |
| 0.7986111111111112 | 0 |
| 0.7993055555555556 | 0 |
| 0.7999999999999999 | 0 |
| 0.8006944444444444 | 0 |
| 0.8013888888888889 | 0 |
| 0.8020833333333334 | 0 |
| 0.8027777777777777 | 0 |
| 0.8034722222222223 | 0 |
| 0.8041666666666667 | 0 |
| 0.8048611111111111 | 0 |
| 0.8055555555555555 | 0 |
| 0.80625 | 0 |
| 0.8069444444444445 | 0 |
| 0.8076388888888889 | 0 |
| 0.8083333333333332 | 0 |
| 0.8090277777777778 | 0 |
| 0.8097222222222222 | 0 |
| 0.8104166666666667 | 0 |
| 0.811111111111111 | 0 |
| 0.8118055555555556 | 0 |
| 0.8125 | 0 |
| 0.8131944444444444 | 0 |
| 0.813888888888889 | 0 |
| 0.8145833333333333 | 0 |
| 0.8152777777777778 | 0 |
| 0.8159722222222222 | 0 |
| 0.8166666666666668 | 0 |
| 0.8173611111111111 | 0 |
| 0.8180555555555555 | 0 |
| 0.81875 | 0 |
| 0.8194444444444445 | 0 |
| 0.8201388888888889 | 0 |
| 0.8208333333333333 | 0 |
| 0.8215277777777777 | 0 |
| 0.8222222222222223 | 0 |
| 0.8229166666666666 | 0 |
| 0.8236111111111111 | 0 |
| 0.8243055555555556 | 0 |
| 0.8250000000000001 | 0 |
| 0.8256944444444444 | 0 |
| 0.8263888888888888 | 0 |
| 0.8270833333333334 | 0 |
| 0.8277777777777778 | 0 |
| 0.8284722222222222 | 0 |
| 0.8291666666666666 | 0 |
| 0.8298611111111112 | 0 |
| 0.8305555555555556 | 0 |
| 0.8312499999999999 | 0 |
| 0.8319444444444444 | 0 |
| 0.8326388888888889 | 0 |
| 0.8333333333333334 | 0 |
| 0.8340277777777777 | 0 |
| 0.8347222222222223 | 0 |
| 0.8354166666666667 | 0 |
| 0.8361111111111111 | 0 |
| 0.8368055555555555 | 0 |
| 0.8375 | 0 |
| 0.8381944444444445 | 0 |
| 0.8388888888888889 | 0 |
| 0.8395833333333332 | 0 |
| 0.8402777777777778 | 0 |
| 0.8409722222222222 | 0 |
| 0.8416666666666667 | 0 |
| 0.842361111111111 | 0 |
| 0.8430555555555556 | 0 |
| 0.84375 | 0 |
| 0.8444444444444444 | 0 |
| 0.845138888888889 | 0 |
| 0.8458333333333333 | 0 |
| 0.8465277777777778 | 0 |
| 0.8472222222222222 | 0 |
| 0.8479166666666668 | 0 |
| 0.8486111111111111 | 0 |
| 0.8493055555555555 | 0 |
| 0.85 | 0 |
| 0.8506944444444445 | 0 |
| 0.8513888888888889 | 0 |
| 0.8520833333333333 | 0 |
| 0.8527777777777777 | 0 |
| 0.8534722222222223 | 0 |
| 0.8541666666666666 | 0 |
| 0.8548611111111111 | 0 |
| 0.8555555555555556 | 0 |
| 0.8562500000000001 | 0 |
| 0.8569444444444444 | 0 |
| 0.8576388888888888 | 0 |
| 0.8583333333333334 | 0 |
| 0.8590277777777778 | 0 |
| 0.8597222222222222 | 0 |
| 0.8604166666666666 | 0 |
| 0.8611111111111112 | 0 |
| 0.8618055555555556 | 0 |
| 0.8624999999999999 | 0 |
| 0.8631944444444444 | 0 |
| 0.8638888888888889 | 0 |
| 0.8645833333333334 | 0 |
| 0.8652777777777777 | 0 |
| 0.8659722222222223 | 0 |
| 0.8666666666666667 | 0 |
| 0.8673611111111111 | 0 |
| 0.8680555555555555 | 0 |
| 0.86875 | 0 |
| 0.8694444444444445 | 0 |
| 0.8701388888888889 | 0 |
| 0.8708333333333332 | 0 |
| 0.8715277777777778 | 0 |
| 0.8722222222222222 | 0 |
| 0.8729166666666667 | 0 |
| 0.873611111111111 | 0 |
| 0.8743055555555556 | 0 |
| 0.875 | 0 |
| 0.8756944444444444 | 0 |
| 0.876388888888889 | 0 |
| 0.8770833333333333 | 0 |
| 0.8777777777777778 | 0 |
| 0.8784722222222222 | 0 |
| 0.8791666666666668 | 0 |
| 0.8798611111111111 | 0 |
| 0.8805555555555555 | 0 |
| 0.88125 | 0 |
| 0.8819444444444445 | 0 |
| 0.8826388888888889 | 0 |
| 0.8833333333333333 | 0 |
| 0.8840277777777777 | 0 |
| 0.8847222222222223 | 0 |
| 0.8854166666666666 | 0 |
| 0.8861111111111111 | 0 |
| 0.8868055555555556 | 0 |
| 0.8875000000000001 | 0 |
| 0.8881944444444444 | 0 |
| 0.8888888888888888 | 0 |
| 0.8895833333333334 | 0 |
| 0.8902777777777778 | 0 |
| 0.8909722222222222 | 0 |
| 0.8916666666666666 | 0 |
| 0.8923611111111112 | 0 |
| 0.8930555555555556 | 0 |
| 0.8937499999999999 | 0 |
| 0.8944444444444444 | 0 |
| 0.8951388888888889 | 0 |
| 0.8958333333333334 | 0 |
| 0.8965277777777777 | 0 |
| 0.8972222222222223 | 0 |
| 0.8979166666666667 | 0 |
| 0.8986111111111111 | 0 |
| 0.8993055555555555 | 0 |
| 0.9 | 0 |
| 0.9006944444444445 | 0 |
| 0.9013888888888889 | 0 |
| 0.9020833333333332 | 0 |
| 0.9027777777777778 | 0 |
| 0.9034722222222222 | 0 |
| 0.9041666666666667 | 0 |
| 0.904861111111111 | 0 |
| 0.9055555555555556 | 0 |
| 0.90625 | 0 |
| 0.9069444444444444 | 0 |
| 0.907638888888889 | 0 |
| 0.9083333333333333 | 0 |
| 0.9090277777777778 | 0 |
| 0.9097222222222222 | 0 |
| 0.9104166666666668 | 0 |
| 0.9111111111111111 | 0 |
| 0.9118055555555555 | 0 |
| 0.9125 | 0 |
| 0.9131944444444445 | 0 |
| 0.9138888888888889 | 0 |
| 0.9145833333333333 | 0 |
| 0.9152777777777777 | 0 |
| 0.9159722222222223 | 0 |
| 0.9166666666666666 | 0 |
| 0.9173611111111111 | 0 |
| 0.9180555555555556 | 0 |
| 0.9187500000000001 | 0 |
| 0.9194444444444444 | 0 |
| 0.9201388888888888 | 0 |
| 0.9208333333333334 | 0 |
| 0.9215277777777778 | 0 |
| 0.9222222222222222 | 0 |
| 0.9229166666666666 | 0 |
| 0.9236111111111112 | 0 |
| 0.9243055555555556 | 0 |
| 0.9249999999999999 | 0 |
| 0.9256944444444444 | 0 |
| 0.9263888888888889 | 0 |
| 0.9270833333333334 | 0 |
| 0.9277777777777777 | 0 |
| 0.9284722222222223 | 0 |
| 0.9291666666666667 | 0 |
| 0.9298611111111111 | 0 |
| 0.9305555555555555 | 0 |
| 0.93125 | 0 |
| 0.9319444444444445 | 0 |
| 0.9326388888888889 | 0 |
| 0.9333333333333332 | 0 |
| 0.9340277777777778 | 0 |
| 0.9347222222222222 | 0 |
| 0.9354166666666667 | 0 |
| 0.936111111111111 | 0 |
| 0.9368055555555556 | 0 |
| 0.9375 | 0 |
| 0.9381944444444444 | 0 |
| 0.938888888888889 | 0 |
| 0.9395833333333333 | 0 |
| 0.9402777777777778 | 0 |
| 0.9409722222222222 | 0 |
| 0.9416666666666668 | 0 |
| 0.9423611111111111 | 0 |
| 0.9430555555555555 | 0 |
| 0.94375 | 0 |
| 0.9444444444444445 | 0 |
| 0.9451388888888889 | 0 |
| 0.9458333333333333 | 0 |
| 0.9465277777777777 | 0 |
| 0.9472222222222223 | 0 |
| 0.9479166666666666 | 0 |
| 0.9486111111111111 | 0 |
| 0.9493055555555556 | 0 |
| 0.9500000000000001 | 0 |
| 0.9506944444444444 | 0 |
| 0.9513888888888888 | 0 |
| 0.9520833333333334 | 0 |
| 0.9527777777777778 | 0 |
| 0.9534722222222222 | 0 |
| 0.9541666666666666 | 0 |
| 0.9548611111111112 | 0 |
| 0.9555555555555556 | 0 |
| 0.9562499999999999 | 0 |
| 0.9569444444444444 | 0 |
| 0.9576388888888889 | 0 |
| 0.9583333333333334 | 0 |
| 0.9590277777777777 | 0 |
| 0.9597222222222223 | 0 |
| 0.9604166666666667 | 0 |
| 0.9611111111111111 | 0 |
| 0.9618055555555555 | 0 |
| 0.9625 | 0 |
| 0.9631944444444445 | 0 |
| 0.9638888888888889 | 0 |
| 0.9645833333333332 | 0 |
| 0.9652777777777778 | 0 |
| 0.9659722222222222 | 0 |
| 0.9666666666666667 | 0 |
| 0.967361111111111 | 0 |
| 0.9680555555555556 | 0 |
| 0.96875 | 0 |
| 0.9694444444444444 | 0 |
| 0.970138888888889 | 0 |
| 0.9708333333333333 | 0 |
| 0.9715277777777778 | 0 |
| 0.9722222222222222 | 0 |
| 0.9729166666666668 | 0 |
| 0.9736111111111111 | 0 |
| 0.9743055555555555 | 0 |
| 0.975 | 0 |
| 0.9756944444444445 | 0 |
| 0.9763888888888889 | 0 |
| 0.9770833333333333 | 0 |
| 0.9777777777777777 | 0 |
| 0.9784722222222223 | 0 |
| 0.9791666666666666 | 0 |
| 0.9798611111111111 | 0 |
| 0.9805555555555556 | 0 |
| 0.9812500000000001 | 0 |
| 0.9819444444444444 | 0 |
| 0.9826388888888888 | 0 |
| 0.9833333333333334 | 0 |
| 0.9840277777777778 | 0 |
| 0.9847222222222222 | 0 |
| 0.9854166666666666 | 0 |
| 0.9861111111111112 | 0 |
| 0.9868055555555556 | 0 |
| 0.9874999999999999 | 0 |
| 0.9881944444444444 | 0 |
| 0.9888888888888889 | 0 |
| 0.9895833333333334 | 0 |
| 0.9902777777777777 | 0 |
| 0.9909722222222223 | 0 |
| 0.9916666666666667 | 0 |
| 0.9923611111111111 | 0 |
| 0.9930555555555555 | 0 |
| 0.99375 | 0 |
| 0.9944444444444445 | 0 |
| 0.9951388888888889 | 0 |
| 0.9958333333333332 | 0 |
| 0.9965277777777778 | 0 |
| 0.9972222222222222 | 0 |
| 0.9979166666666667 | 0 |
| 0.998611111111111 | 0 |
| 0.9993055555555556 | 0 |